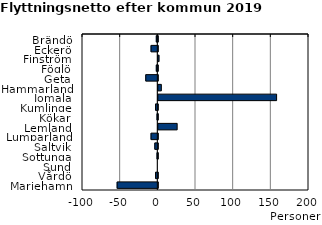
| Category | Series 0 |
|---|---|
| Brändö | -2 |
| Eckerö | -9 |
| Finström | 1 |
| Föglö | -2 |
| Geta | -16 |
| Hammarland | 4 |
| Jomala | 157 |
| Kumlinge | -3 |
| Kökar | -1 |
| Lemland | 25 |
| Lumparland | -9 |
| Saltvik | -4 |
| Sottunga | -1 |
| Sund | 0 |
| Vårdö | -3 |
| Mariehamn | -54 |